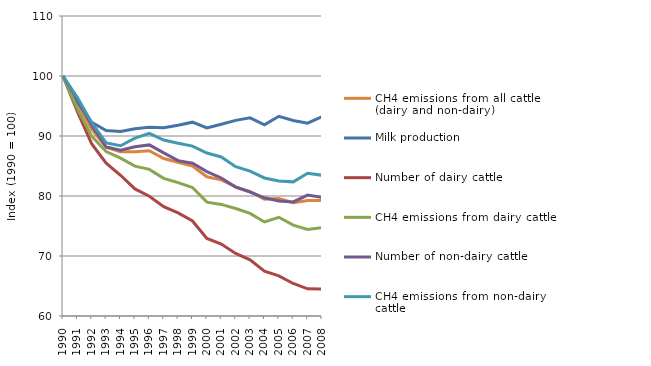
| Category | CH4 emissions from all cattle (dairy and non-dairy) | Milk production | Number of dairy cattle | CH4 emissions from dairy cattle | Number of non-dairy cattle | CH4 emissions from non-dairy cattle |
|---|---|---|---|---|---|---|
| 1990.0 | 100 | 100 | 100 | 100 | 100 | 100 |
| 1991.0 | 95.51 | 95.663 | 94.066 | 94.545 | 96.185 | 96.41 |
| 1992.0 | 91.112 | 92.266 | 88.666 | 89.938 | 91.737 | 92.209 |
| 1993.0 | 88.149 | 90.921 | 85.456 | 87.404 | 88.166 | 88.845 |
| 1994.0 | 87.374 | 90.737 | 83.457 | 86.302 | 87.644 | 88.374 |
| 1995.0 | 87.386 | 91.211 | 81.176 | 84.974 | 88.215 | 89.637 |
| 1996.0 | 87.538 | 91.45 | 79.973 | 84.437 | 88.514 | 90.434 |
| 1997.0 | 86.243 | 91.387 | 78.234 | 82.944 | 87.189 | 89.322 |
| 1998.0 | 85.622 | 91.789 | 77.186 | 82.234 | 85.89 | 88.784 |
| 1999.0 | 84.989 | 92.305 | 75.833 | 81.423 | 85.469 | 88.319 |
| 2000.0 | 83.208 | 91.332 | 72.935 | 78.976 | 84.062 | 87.159 |
| 2001.0 | 82.689 | 91.964 | 71.995 | 78.598 | 83.004 | 86.509 |
| 2002.0 | 81.514 | 92.604 | 70.419 | 77.914 | 81.482 | 84.874 |
| 2003.0 | 80.744 | 93.026 | 69.363 | 77.1 | 80.668 | 84.146 |
| 2004.0 | 79.466 | 91.872 | 67.471 | 75.672 | 79.702 | 83.007 |
| 2005.0 | 79.576 | 93.287 | 66.695 | 76.452 | 79.18 | 82.492 |
| 2006.0 | 78.877 | 92.596 | 65.419 | 75.148 | 79.014 | 82.357 |
| 2007.0 | 79.265 | 92.143 | 64.535 | 74.428 | 80.151 | 83.78 |
| 2008.0 | 79.252 | 93.209 | 64.489 | 74.747 | 79.783 | 83.458 |